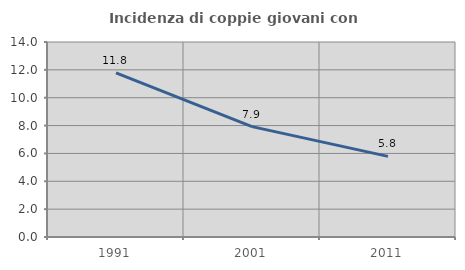
| Category | Incidenza di coppie giovani con figli |
|---|---|
| 1991.0 | 11.789 |
| 2001.0 | 7.925 |
| 2011.0 | 5.789 |